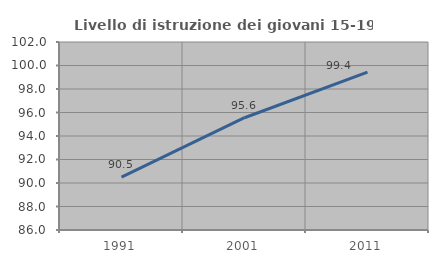
| Category | Livello di istruzione dei giovani 15-19 anni |
|---|---|
| 1991.0 | 90.494 |
| 2001.0 | 95.556 |
| 2011.0 | 99.438 |